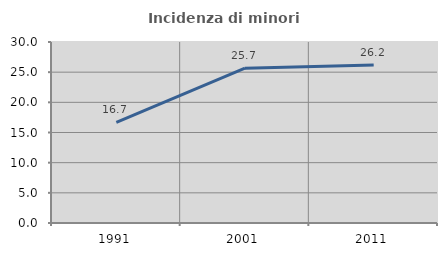
| Category | Incidenza di minori stranieri |
|---|---|
| 1991.0 | 16.667 |
| 2001.0 | 25.664 |
| 2011.0 | 26.196 |